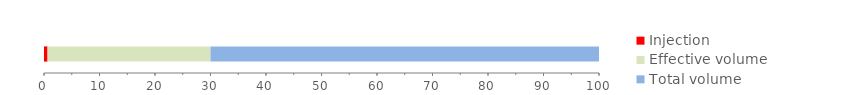
| Category | Injection | Effective volume | Total volume |
|---|---|---|---|
| 0 | 0.637 | 29.363 | 70 |